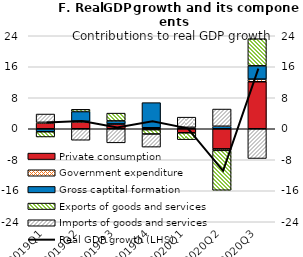
| Category | Private consumption | Government expenditure | Gross captital formation | Exports of goods and services | Imports of goods and services |
|---|---|---|---|---|---|
| 2019Q1 | 1.488 | 0.166 | -0.77 | -1.355 | 2.148 |
| 2019Q2 | 1.749 | 0.188 | 2.501 | 0.585 | -2.961 |
| 2019Q3 | 1.173 | 0.083 | 0.773 | 2.006 | -3.636 |
| 2019Q4 | 0.256 | -0.23 | 6.482 | -1.124 | -3.383 |
| 2020Q1 | -1.046 | 0.251 | 0.116 | -1.768 | 2.625 |
| 2020Q2 | -5.194 | -0.384 | 0.647 | -10.293 | 4.44 |
| 2020Q3 | 12.128 | 0.674 | 3.432 | 7.006 | -7.677 |